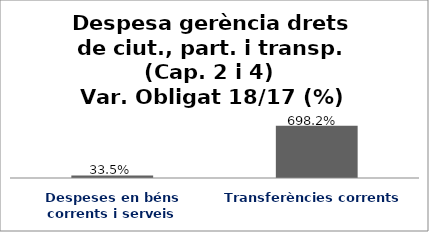
| Category | Series 0 |
|---|---|
| Despeses en béns corrents i serveis | 0.335 |
| Transferències corrents | 6.982 |